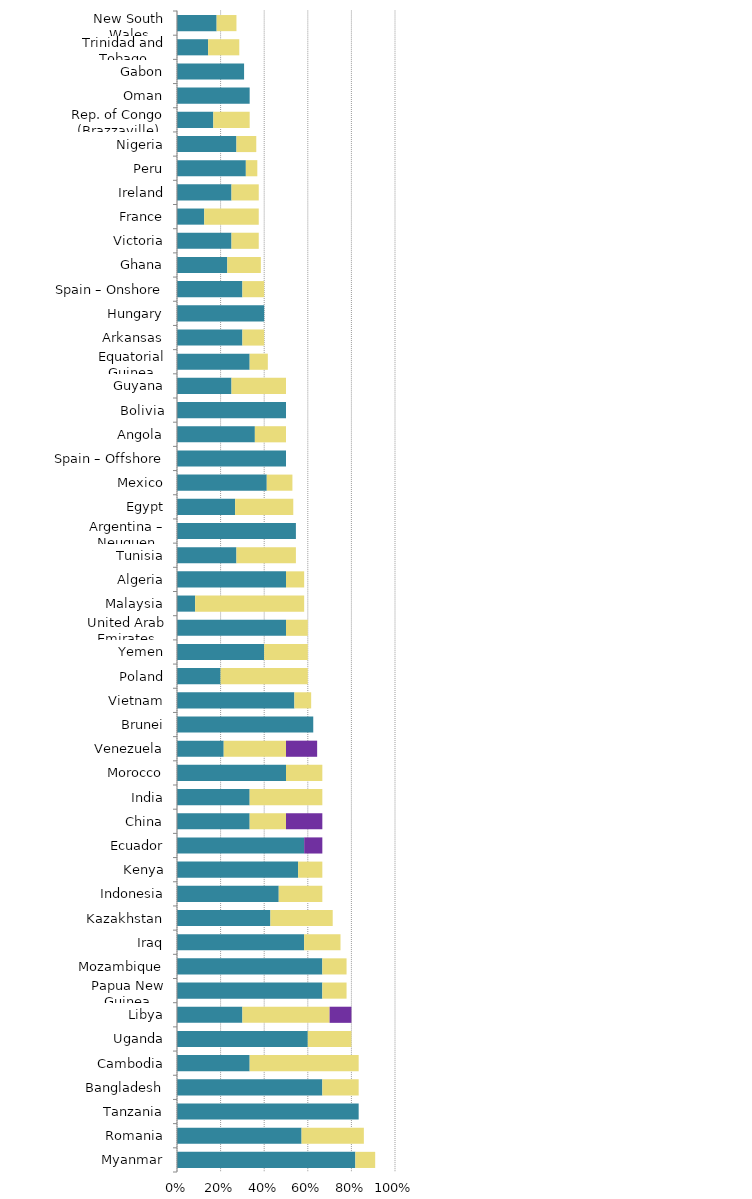
| Category | Mild deterrent to investment | Strong deterrent to investment | Would not pursue investment due to this factor |
|---|---|---|---|
| Myanmar | 0.818 | 0.091 | 0 |
| Romania | 0.571 | 0.286 | 0 |
| Tanzania | 0.833 | 0 | 0 |
| Bangladesh | 0.667 | 0.167 | 0 |
| Cambodia | 0.333 | 0.5 | 0 |
| Uganda | 0.6 | 0.2 | 0 |
| Libya | 0.3 | 0.4 | 0.1 |
| Papua New Guinea | 0.667 | 0.111 | 0 |
| Mozambique | 0.667 | 0.111 | 0 |
| Iraq | 0.583 | 0.167 | 0 |
| Kazakhstan | 0.429 | 0.286 | 0 |
| Indonesia | 0.467 | 0.2 | 0 |
| Kenya | 0.556 | 0.111 | 0 |
| Ecuador | 0.583 | 0 | 0.083 |
| China | 0.333 | 0.167 | 0.167 |
| India | 0.333 | 0.333 | 0 |
| Morocco | 0.5 | 0.167 | 0 |
| Venezuela | 0.214 | 0.286 | 0.143 |
| Brunei | 0.625 | 0 | 0 |
| Vietnam | 0.538 | 0.077 | 0 |
| Poland | 0.2 | 0.4 | 0 |
| Yemen | 0.4 | 0.2 | 0 |
| United Arab Emirates | 0.5 | 0.1 | 0 |
| Malaysia | 0.083 | 0.5 | 0 |
| Algeria | 0.5 | 0.083 | 0 |
| Tunisia | 0.273 | 0.273 | 0 |
| Argentina – Neuquen | 0.545 | 0 | 0 |
| Egypt | 0.267 | 0.267 | 0 |
| Mexico | 0.412 | 0.118 | 0 |
| Spain – Offshore | 0.5 | 0 | 0 |
| Angola | 0.357 | 0.143 | 0 |
| Bolivia | 0.5 | 0 | 0 |
| Guyana | 0.25 | 0.25 | 0 |
| Equatorial Guinea | 0.333 | 0.083 | 0 |
| Arkansas | 0.3 | 0.1 | 0 |
| Hungary | 0.4 | 0 | 0 |
| Spain – Onshore | 0.3 | 0.1 | 0 |
| Ghana | 0.231 | 0.154 | 0 |
| Victoria | 0.25 | 0.125 | 0 |
| France | 0.125 | 0.25 | 0 |
| Ireland | 0.25 | 0.125 | 0 |
| Peru | 0.316 | 0.053 | 0 |
| Nigeria | 0.273 | 0.091 | 0 |
| Rep. of Congo (Brazzaville) | 0.167 | 0.167 | 0 |
| Oman | 0.333 | 0 | 0 |
| Gabon | 0.308 | 0 | 0 |
| Trinidad and Tobago | 0.143 | 0.143 | 0 |
| New South Wales | 0.182 | 0.091 | 0 |